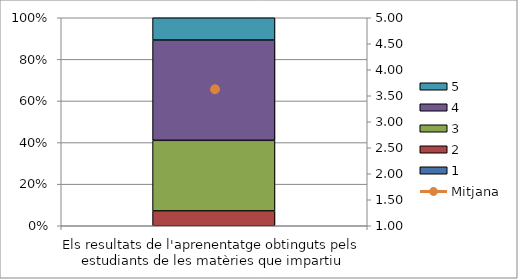
| Category | 1 | 2 | 3 | 4 | 5 |
|---|---|---|---|---|---|
| Els resultats de l'aprenentatge obtinguts pels estudiants de les matèries que impartiu | 0 | 4 | 19 | 27 | 6 |